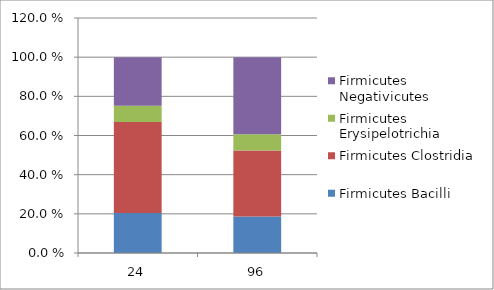
| Category | Firmicutes |
|---|---|
| 24.0 | 0.247 |
| 96.0 | 0.393 |